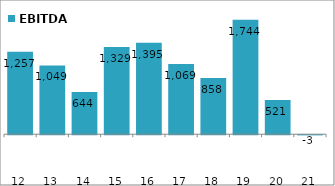
| Category | EBITDA |
|---|---|
| 2012-03-31 | 1256.69 |
| 2013-03-31 | 1048.52 |
| 2014-03-31 | 643.57 |
| 2015-03-31 | 1329.16 |
| 2016-03-31 | 1394.51 |
| 2017-03-31 | 1069.1 |
| 2018-03-31 | 857.85 |
| 2019-03-31 | 1743.73 |
| 2020-03-31 | 521.42 |
| 2021-03-31 | -2.59 |